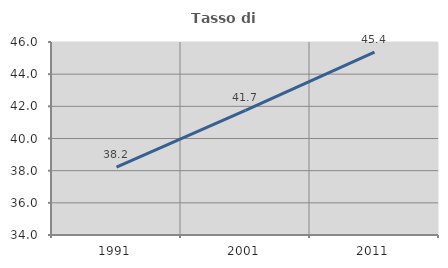
| Category | Tasso di occupazione   |
|---|---|
| 1991.0 | 38.228 |
| 2001.0 | 41.748 |
| 2011.0 | 45.375 |